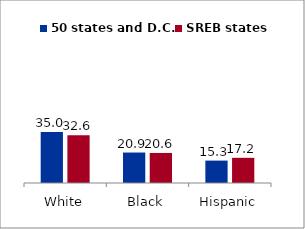
| Category | 50 states and D.C. | SREB states |
|---|---|---|
| White | 34.967 | 32.629 |
| Black | 20.871 | 20.58 |
| Hispanic | 15.346 | 17.248 |